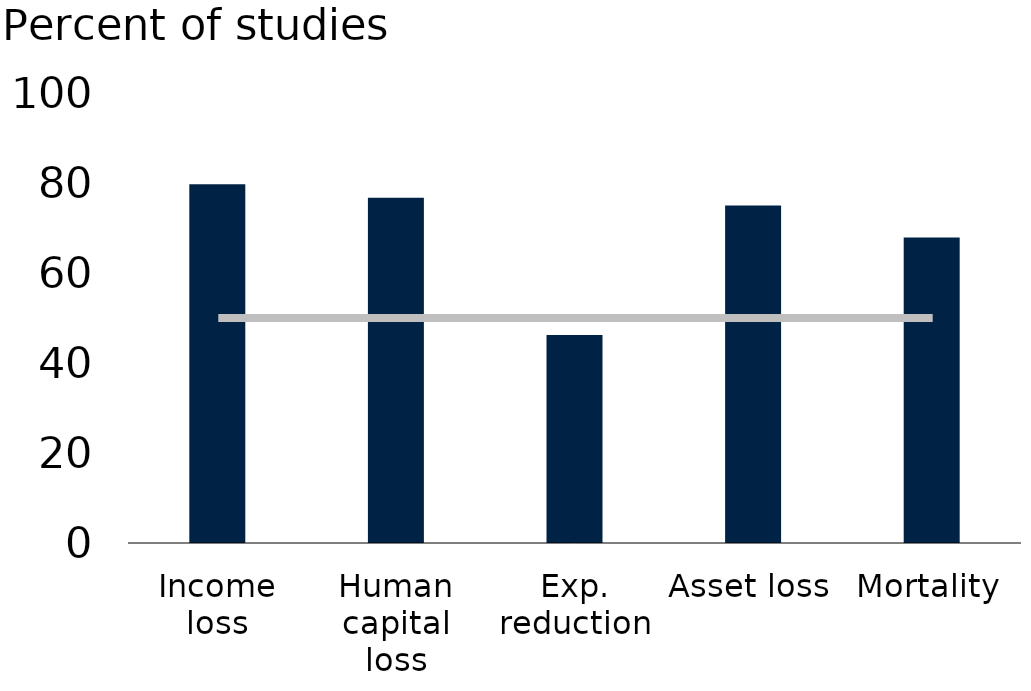
| Category | excl CCDRs |
|---|---|
| Income loss | 79.7 |
| Human capital loss | 76.7 |
| Exp. reduction | 46.2 |
| Asset loss | 75 |
| Mortality | 67.9 |